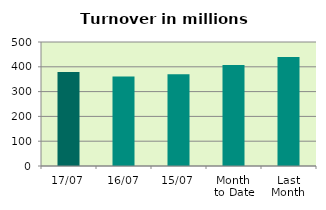
| Category | Series 0 |
|---|---|
| 17/07 | 379.071 |
| 16/07 | 360.996 |
| 15/07 | 369.473 |
| Month 
to Date | 407.33 |
| Last
Month | 439.695 |